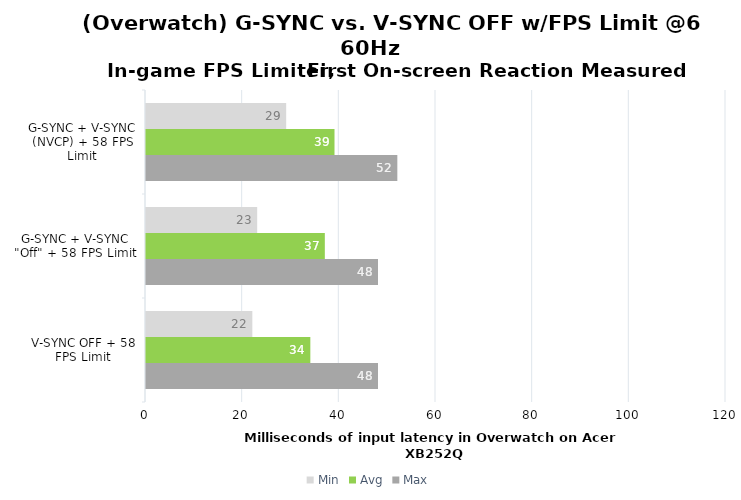
| Category | Min | Avg | Max |
|---|---|---|---|
| G-SYNC + V-SYNC (NVCP) + 58 FPS Limit | 29 | 39 | 52 |
| G-SYNC + V-SYNC "Off" + 58 FPS Limit | 23 | 37 | 48 |
| V-SYNC OFF + 58 FPS Limit | 22 | 34 | 48 |